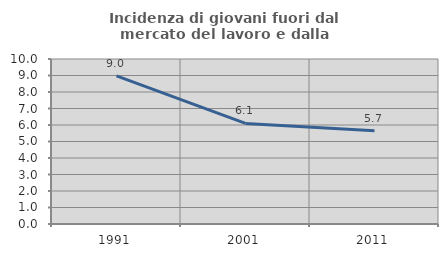
| Category | Incidenza di giovani fuori dal mercato del lavoro e dalla formazione  |
|---|---|
| 1991.0 | 8.974 |
| 2001.0 | 6.093 |
| 2011.0 | 5.658 |